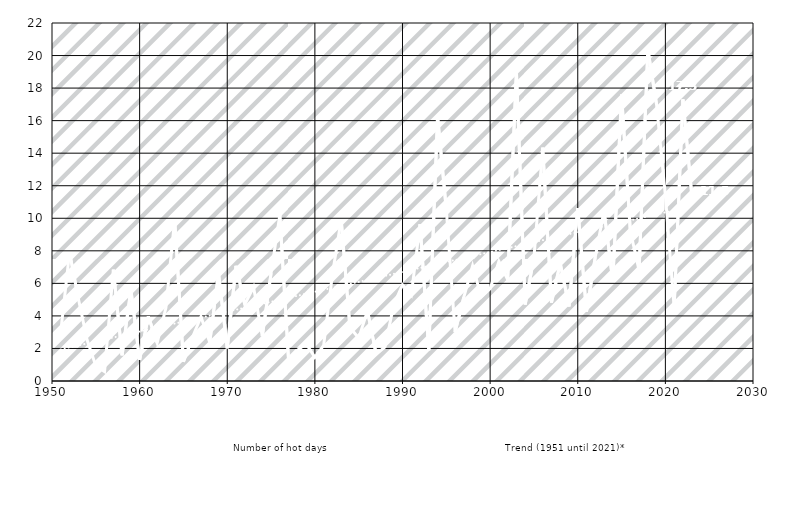
| Category | Number of hot days |
|---|---|
| 1951.0 | 3.02 |
| 1952.0 | 7.91 |
| 1953.0 | 5.08 |
| 1954.0 | 2.53 |
| 1955.0 | 0.93 |
| 1956.0 | 0.58 |
| 1957.0 | 6.85 |
| 1958.0 | 1.58 |
| 1959.0 | 5.63 |
| 1960.0 | 1.3 |
| 1961.0 | 3.97 |
| 1962.0 | 2.34 |
| 1963.0 | 4.5 |
| 1964.0 | 9.93 |
| 1965.0 | 1.18 |
| 1966.0 | 2.64 |
| 1967.0 | 3.95 |
| 1968.0 | 2.38 |
| 1969.0 | 6.63 |
| 1970.0 | 2.01 |
| 1971.0 | 7.08 |
| 1972.0 | 4.7 |
| 1973.0 | 5.78 |
| 1974.0 | 2.75 |
| 1975.0 | 6.63 |
| 1976.0 | 10.2 |
| 1977.0 | 1.25 |
| 1978.0 | 1.89 |
| 1979.0 | 2.29 |
| 1980.0 | 1.45 |
| 1981.0 | 2.19 |
| 1982.0 | 6.54 |
| 1983.0 | 9.93 |
| 1984.0 | 3.3 |
| 1985.0 | 2.63 |
| 1986.0 | 4.31 |
| 1987.0 | 1.64 |
| 1988.0 | 2.1 |
| 1989.0 | 4.67 |
| 1990.0 | 5.91 |
| 1991.0 | 5.27 |
| 1992.0 | 9.64 |
| 1993.0 | 1.89 |
| 1994.0 | 16.27 |
| 1995.0 | 10.54 |
| 1996.0 | 3 |
| 1997.0 | 5.16 |
| 1998.0 | 7.08 |
| 1999.0 | 5.16 |
| 2000.0 | 5.67 |
| 2001.0 | 7.36 |
| 2002.0 | 6.23 |
| 2003.0 | 19.01 |
| 2004.0 | 4.7 |
| 2005.0 | 7.57 |
| 2006.0 | 14.34 |
| 2007.0 | 4.82 |
| 2008.0 | 7.24 |
| 2009.0 | 4.58 |
| 2010.0 | 10.63 |
| 2011.0 | 4.27 |
| 2012.0 | 7.62 |
| 2013.0 | 10.47 |
| 2014.0 | 6.14 |
| 2015.0 | 17.6 |
| 2016.0 | 9.21 |
| 2017.0 | 6.8 |
| 2018.0 | 20.37 |
| 2019.0 | 16.97 |
| 2020.0 | 11.39 |
| 2021.0 | 4.53 |
| 2022.0 | 17.3 |
| 2023.0 | 11.5 |